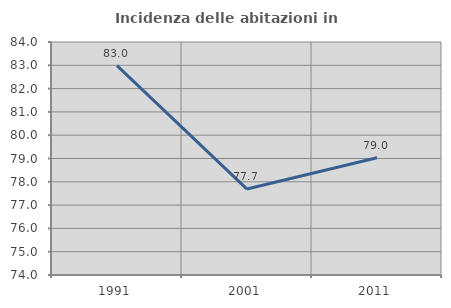
| Category | Incidenza delle abitazioni in proprietà  |
|---|---|
| 1991.0 | 82.983 |
| 2001.0 | 77.688 |
| 2011.0 | 79.032 |